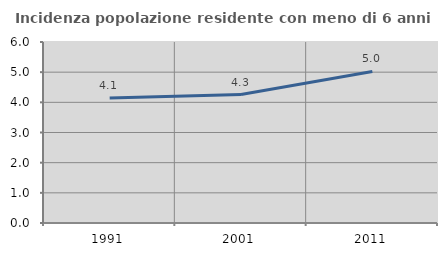
| Category | Incidenza popolazione residente con meno di 6 anni |
|---|---|
| 1991.0 | 4.146 |
| 2001.0 | 4.257 |
| 2011.0 | 5.025 |